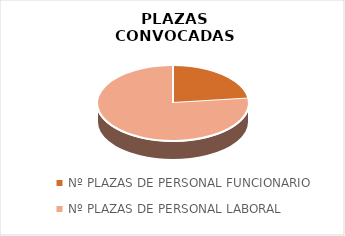
| Category | Series 0 |
|---|---|
| Nº PLAZAS DE PERSONAL FUNCIONARIO | 1167 |
| Nº PLAZAS DE PERSONAL LABORAL | 3869 |